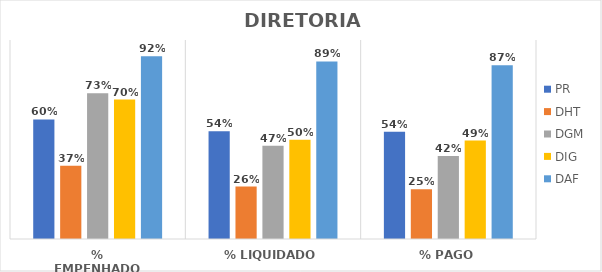
| Category | PR | DHT | DGM | DIG | DAF |
|---|---|---|---|---|---|
| % EMPENHADO | 0.601 | 0.369 | 0.733 | 0.701 | 0.918 |
| % LIQUIDADO | 0.542 | 0.264 | 0.469 | 0.499 | 0.892 |
| % PAGO | 0.539 | 0.25 | 0.417 | 0.495 | 0.874 |